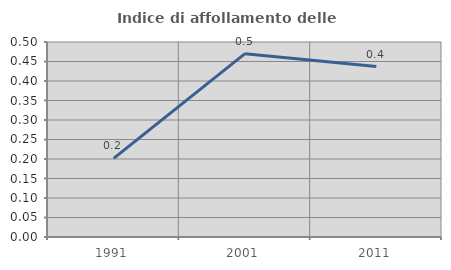
| Category | Indice di affollamento delle abitazioni  |
|---|---|
| 1991.0 | 0.201 |
| 2001.0 | 0.47 |
| 2011.0 | 0.437 |